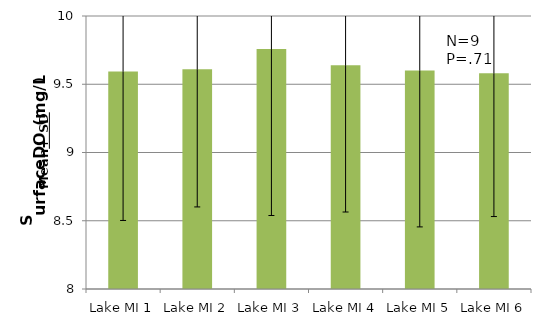
| Category | Series 2 |
|---|---|
| Lake MI 1 | 9.593 |
| Lake MI 2 | 9.61 |
| Lake MI 3 | 9.758 |
| Lake MI 4 | 9.64 |
| Lake MI 5 | 9.6 |
| Lake MI 6 | 9.58 |